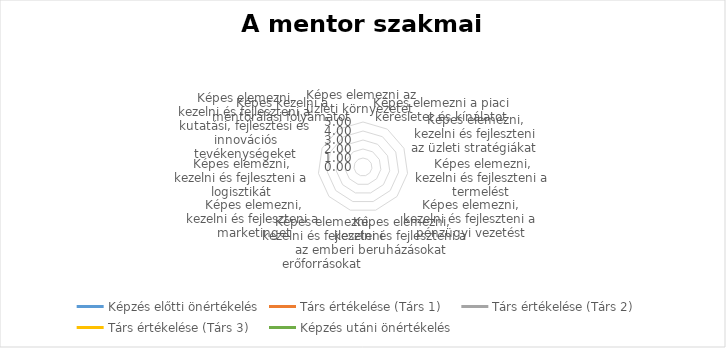
| Category | Képzés előtti önértékelés | Társ értékelése (Társ 1) | Társ értékelése (Társ 2) | Társ értékelése (Társ 3) | Képzés utáni önértékelés |
|---|---|---|---|---|---|
| Képes elemezni az üzleti környezetet  | 0 | 0 | 0 | 0 | 0 |
| Képes elemezni a piaci keresletet és kínálatot | 0 | 0 | 0 | 0 | 0 |
| Képes elemezni, kezelni és fejleszteni az üzleti stratégiákat  | 0 | 0 | 0 | 0 | 0 |
| Képes elemezni, kezelni és fejleszteni a termelést  | 0 | 0 | 0 | 0 | 0 |
| Képes elemezni, kezelni és fejleszteni a pénzügyi vezetést | 0 | 0 | 0 | 0 | 0 |
| Képes elemezni, kezelni és fejleszteni a beruházásokat | 0 | 0 | 0 | 0 | 0 |
| Képes elemezni, kezelni és fejleszteni az emberi erőforrásokat  | 0 | 0 | 0 | 0 | 0 |
| Képes elemezni, kezelni és fejleszteni a marketinget | 0 | 0 | 0 | 0 | 0 |
| Képes elemezni, kezelni és fejleszteni a logisztikát | 0 | 0 | 0 | 0 | 0 |
| Képes elemezni, kezelni és fejleszteni a kutatási, fejlesztési és innovációs tevékenységeket | 0 | 0 | 0 | 0 | 0 |
| Képes kezelni a mentorálási folyamatot | 0 | 0 | 0 | 0 | 0 |